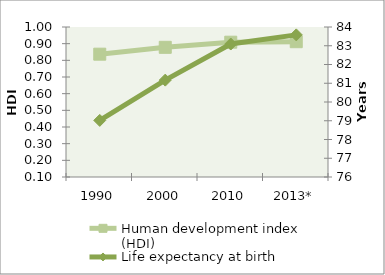
| Category | Human development index (HDI) |
|---|---|
| 1990 | 0.837 |
| 2000 | 0.878 |
| 2010 | 0.909 |
| 2013* | 0.912 |